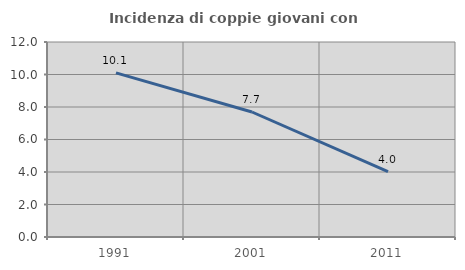
| Category | Incidenza di coppie giovani con figli |
|---|---|
| 1991.0 | 10.101 |
| 2001.0 | 7.692 |
| 2011.0 | 4.027 |